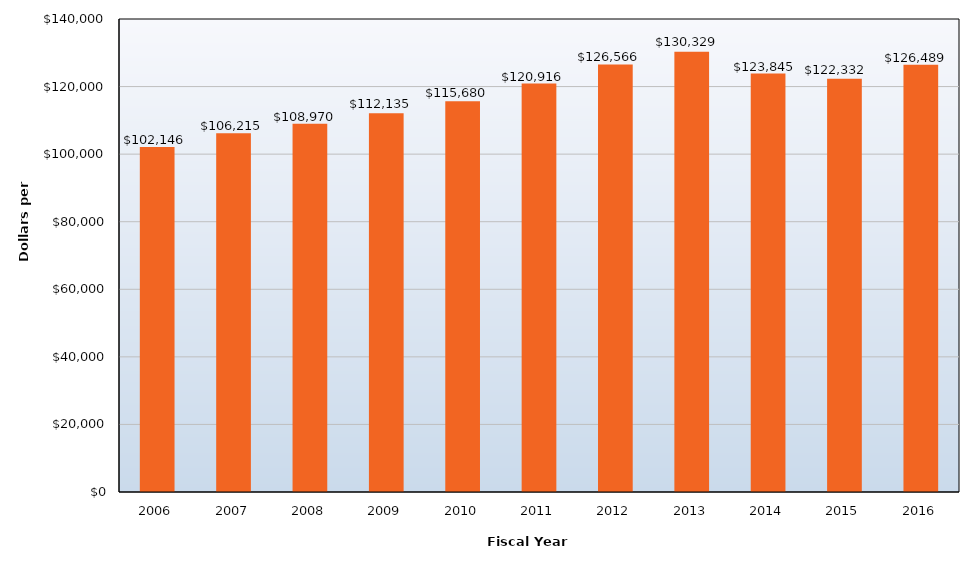
| Category | Total Revenue |
|---|---|
| 2006.0 | 102146 |
| 2007.0 | 106215 |
| 2008.0 | 108970 |
| 2009.0 | 112135 |
| 2010.0 | 115680 |
| 2011.0 | 120916 |
| 2012.0 | 126566 |
| 2013.0 | 130329 |
| 2014.0 | 123845 |
| 2015.0 | 122332 |
| 2016.0 | 126489 |